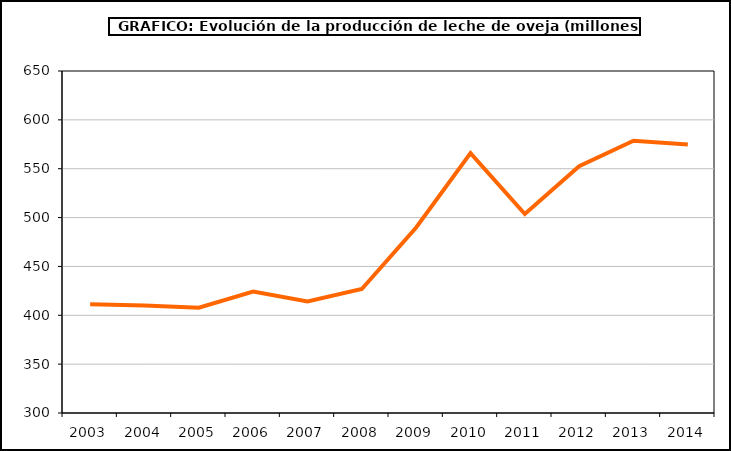
| Category | leche oveja |
|---|---|
| 2003.0 | 411.325 |
| 2004.0 | 410.103 |
| 2005.0 | 407.764 |
| 2006.0 | 424.332 |
| 2007.0 | 414.211 |
| 2008.0 | 426.918 |
| 2009.0 | 489.823 |
| 2010.0 | 565.948 |
| 2011.0 | 503.6 |
| 2012.0 | 552.517 |
| 2013.0 | 578.581 |
| 2014.0 | 574.682 |